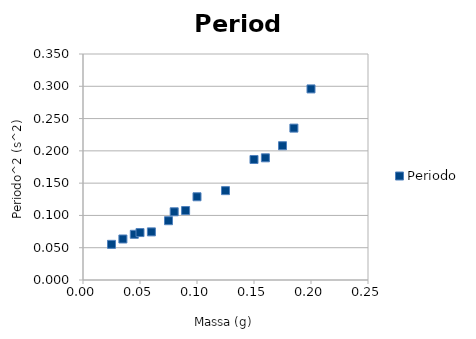
| Category | Periodo |
|---|---|
| 0.025 | 0.055 |
| 0.035 | 0.064 |
| 0.045 | 0.071 |
| 0.05 | 0.073 |
| 0.06 | 0.075 |
| 0.075 | 0.092 |
| 0.08 | 0.106 |
| 0.09 | 0.108 |
| 0.1 | 0.129 |
| 0.125 | 0.138 |
| 0.15 | 0.187 |
| 0.16 | 0.189 |
| 0.175 | 0.208 |
| 0.185 | 0.235 |
| 0.2 | 0.296 |